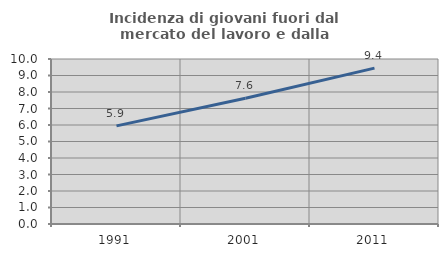
| Category | Incidenza di giovani fuori dal mercato del lavoro e dalla formazione  |
|---|---|
| 1991.0 | 5.946 |
| 2001.0 | 7.625 |
| 2011.0 | 9.449 |